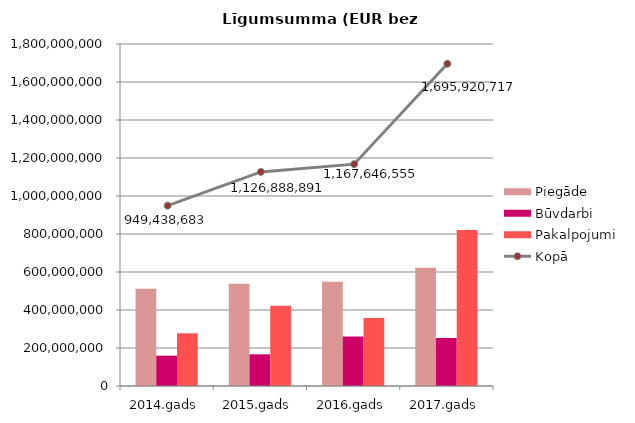
| Category | Piegāde | Būvdarbi | Pakalpojumi |
|---|---|---|---|
| 2014.gads | 511618660 | 159704322 | 278115701 |
| 2015.gads | 537574641 | 166697834 | 422616416 |
| 2016.gads | 548591284 | 261010806 | 358044465 |
| 2017.gads | 622598399 | 252506051 | 820816267 |